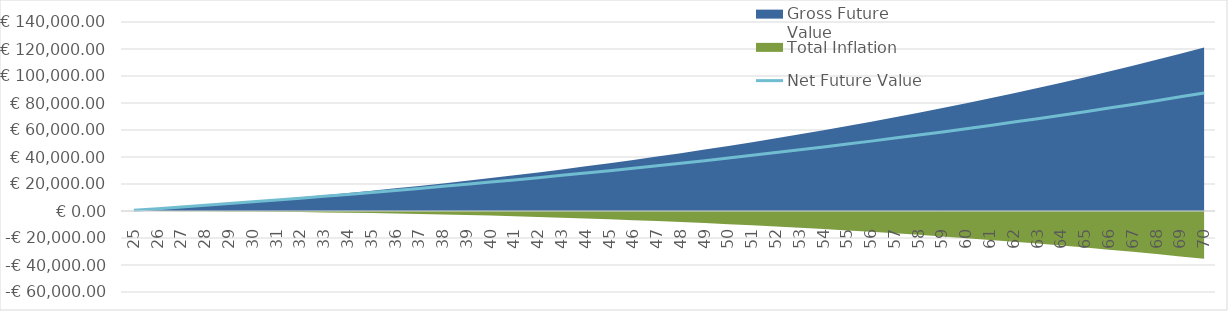
| Category | Net Future Value |
|---|---|
| 25.0 | 499.8 |
| 26.0 | 1709.316 |
| 27.0 | 2943.022 |
| 28.0 | 4201.403 |
| 29.0 | 5484.951 |
| 30.0 | 6794.17 |
| 31.0 | 8129.573 |
| 32.0 | 9491.685 |
| 33.0 | 10881.038 |
| 34.0 | 12298.179 |
| 35.0 | 13743.663 |
| 36.0 | 15218.056 |
| 37.0 | 16721.937 |
| 38.0 | 18255.896 |
| 39.0 | 19820.534 |
| 40.0 | 21416.464 |
| 41.0 | 23044.314 |
| 42.0 | 24704.72 |
| 43.0 | 26398.334 |
| 44.0 | 28125.821 |
| 45.0 | 29887.858 |
| 46.0 | 31685.135 |
| 47.0 | 33518.357 |
| 48.0 | 35388.245 |
| 49.0 | 37295.529 |
| 50.0 | 39240.96 |
| 51.0 | 41225.299 |
| 52.0 | 43249.325 |
| 53.0 | 45313.832 |
| 54.0 | 47419.628 |
| 55.0 | 49567.541 |
| 56.0 | 51758.412 |
| 57.0 | 53993.1 |
| 58.0 | 56272.482 |
| 59.0 | 58597.452 |
| 60.0 | 60968.921 |
| 61.0 | 63387.819 |
| 62.0 | 65855.095 |
| 63.0 | 68371.717 |
| 64.0 | 70938.672 |
| 65.0 | 73556.965 |
| 66.0 | 76227.624 |
| 67.0 | 78951.697 |
| 68.0 | 81730.251 |
| 69.0 | 84564.376 |
| 70.0 | 87455.183 |